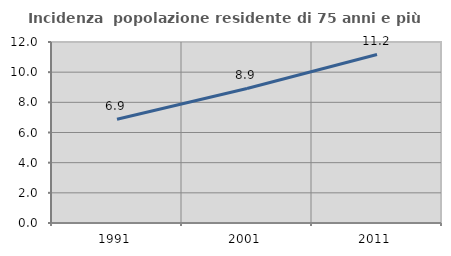
| Category | Incidenza  popolazione residente di 75 anni e più |
|---|---|
| 1991.0 | 6.877 |
| 2001.0 | 8.919 |
| 2011.0 | 11.175 |